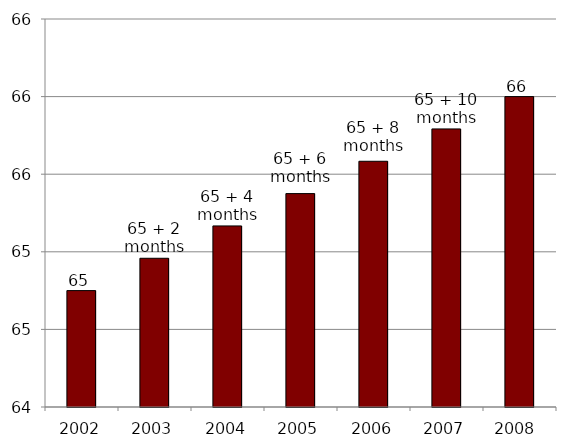
| Category | Series 0 |
|---|---|
| 2002 | 65 |
| 2003 | 65.167 |
| 2004 | 65.333 |
| 2005 | 65.5 |
| 2006 | 65.667 |
| 2007 | 65.833 |
| 2008  | 66 |